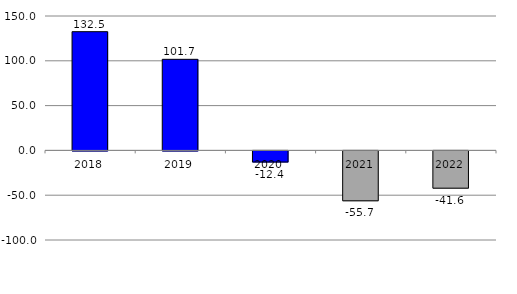
| Category | Montant |
|---|---|
| 2018.0 | 132.496 |
| 2019.0 | 101.65 |
| 2020.0 | -12.425 |
| 2021.0 | -55.7 |
| 2022.0 | -41.6 |